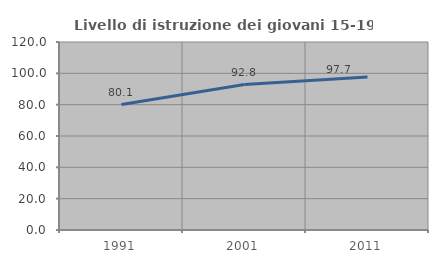
| Category | Livello di istruzione dei giovani 15-19 anni |
|---|---|
| 1991.0 | 80.069 |
| 2001.0 | 92.807 |
| 2011.0 | 97.667 |